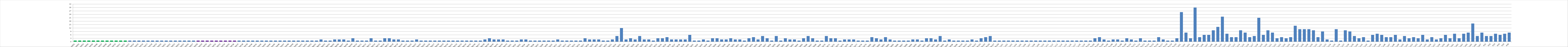
| Category | Series 0 |
|---|---|
| AW01 | 1 |
| AW02 | 1 |
| AW03 | 1 |
| AW04 | 1 |
| AW05 | 1 |
| AW06 | 1 |
| AW07 | 1 |
| AW08 | 1 |
| AW09 | 1 |
| AW10 | 1 |
| AW11 | 1 |
| AW12 | 1 |
| AW13 | 1 |
| AW14 | 1 |
| AW15 | 1 |
| AW16 | 1 |
| AW17 | 1 |
| AW18 | 1 |
| AW19 | 1 |
| AW20 | 1 |
| AW21 | 1 |
| AW22 | 1 |
| AW23 | 1 |
| AW24 | 1 |
| AW25 | 1 |
| AW26 | 1 |
| AW27 | 1 |
| AW28 | 1 |
| AW29 | 1 |
| AW30 | 1 |
| AW31 | 1 |
| AW32 | 1 |
| AW33 | 1 |
| AW34 | 1 |
| AW35 | 1 |
| AW36 | 1 |
| AW37 | 1 |
| AW38 | 1 |
| AW39 | 1 |
| AW40 | 1 |
| AW41 | 1 |
| AW42 | 1 |
| AW43 | 1 |
| AW44 | 1 |
| AW45 | 1 |
| AW46 | 1 |
| AW47 | 1 |
| AW48 | 1 |
| AW49 | 1 |
| AW50 | 1 |
| AW51 | 1 |
| AW52 | 1 |
| AW53 | 1 |
| BW01 | 1 |
| BW02 | 2 |
| BW03 | 1 |
| BW04 | 1 |
| BW05 | 2 |
| BW06 | 2 |
| BW07 | 2 |
| BW08 | 1 |
| BW09 | 3 |
| BW10 | 1 |
| BW11 | 1 |
| BW12 | 1 |
| BW13 | 3 |
| BW14 | 1 |
| BW15 | 1 |
| BW16 | 3 |
| BW17 | 3 |
| BW18 | 2 |
| BW19 | 2 |
| BW20 | 1 |
| BW21 | 1 |
| BW22 | 1 |
| BW23 | 2 |
| BW24 | 1 |
| BW25 | 1 |
| BW26 | 1 |
| BW27 | 1 |
| BW28 | 1 |
| BW29 | 1 |
| BW30 | 1 |
| BW31 | 1 |
| BW32 | 1 |
| BW33 | 1 |
| BW34 | 1 |
| BW35 | 1 |
| BW36 | 1 |
| BW37 | 1 |
| BW38 | 2 |
| BW39 | 3 |
| BW40 | 2 |
| BW41 | 2 |
| BW42 | 2 |
| BW43 | 1 |
| CW01 | 1 |
| CW02 | 1 |
| CW03 | 2 |
| CW04 | 2 |
| CW05 | 1 |
| CW06 | 1 |
| CW07 | 1 |
| CW08 | 1 |
| CW09 | 1 |
| CW10 | 1 |
| CW11 | 2 |
| CW12 | 1 |
| CW13 | 1 |
| CW14 | 1 |
| CW15 | 1 |
| CW16 | 1 |
| CW17 | 3 |
| CW18 | 2 |
| CW19 | 2 |
| CW20 | 2 |
| CW21 | 1 |
| CW22 | 1 |
| CW23 | 2 |
| CW24 | 5 |
| CW25 | 12 |
| CW26 | 2 |
| CW27 | 3 |
| CW28 | 2 |
| CW29 | 5 |
| CW30 | 2 |
| CW31 | 2 |
| CW32 | 1 |
| CW33 | 3 |
| CW34 | 3 |
| CW35 | 4 |
| CW36 | 2 |
| CW37 | 2 |
| CW38 | 2 |
| CW39 | 2 |
| CW40 | 6 |
| CW41 | 1 |
| CW42 | 1 |
| CW43 | 2 |
| CW44 | 1 |
| CW45 | 3 |
| CW46 | 3 |
| CW47 | 2 |
| CW48 | 2 |
| CW49 | 3 |
| CW50 | 2 |
| CW51 | 2 |
| CW52 | 1 |
| CW53 | 3 |
| CW54 | 4 |
| CW55 | 2 |
| CW56 | 5 |
| CW57 | 3 |
| CW58 | 1 |
| CW59 | 5 |
| CW60 | 1 |
| CW61 | 3 |
| CW62 | 2 |
| CW63 | 2 |
| CW64 | 1 |
| CW65 | 3 |
| CW66 | 5 |
| CW67 | 3 |
| CW68 | 1 |
| CW69 | 1 |
| CW70 | 5 |
| CW71 | 3 |
| CW72 | 3 |
| CW73 | 1 |
| CW74 | 2 |
| CW75 | 2 |
| CW76 | 2 |
| CW77 | 1 |
| CW78 | 1 |
| CW79 | 1 |
| CW80 | 4 |
| CW81 | 3 |
| CW82 | 2 |
| CW83 | 4 |
| CW84 | 2 |
| CW85 | 1 |
| CW86 | 1 |
| CW87 | 1 |
| CW88 | 1 |
| CW89 | 2 |
| CW90 | 2 |
| CW91 | 1 |
| CW92 | 3 |
| CW93 | 3 |
| CW94 | 2 |
| CW95 | 5 |
| CW96 | 1 |
| CW97 | 2 |
| CW98 | 1 |
| CW99 | 1 |
| CW100 | 1 |
| CW101 | 1 |
| CW102 | 2 |
| CW103 | 1 |
| CW104 | 3 |
| CW105 | 4 |
| CW106 | 5 |
| CW107 | 1 |
| CW108 | 1 |
| A.U01 | 1 |
| A.U02 | 1 |
| A.U03 | 1 |
| A.U04 | 1 |
| A.U05 | 1 |
| A.U06 | 1 |
| A.U07 | 1 |
| A.U08 | 1 |
| A.U09 | 1 |
| A.U10 | 1 |
| A.U11 | 1 |
| A.U12 | 1 |
| A.U13 | 1 |
| A.U14 | 1 |
| A.U15 | 1 |
| A.U16 | 1 |
| A.U17 | 1 |
| A.U18 | 1 |
| A.U19 | 1 |
| B.U01 | 1 |
| B.U02 | 3 |
| B.U03 | 4 |
| B.U04 | 2 |
| B.U05 | 1 |
| B.U06 | 2 |
| B.U07 | 2 |
| B.U08 | 1 |
| B.U09 | 3 |
| B.U10 | 2 |
| B.U11 | 1 |
| B.U12 | 3 |
| B.U13 | 1 |
| B.U14 | 1 |
| B.U15 | 1 |
| B.U16 | 4 |
| B.U17 | 2 |
| B.U18 | 1 |
| B.U19 | 1 |
| B.U20 | 3 |
| C.U01 | 26 |
| C.U02 | 8 |
| C.U03 | 3 |
| C.U04 | 30 |
| C.U05 | 4 |
| C.U06 | 6 |
| C.U07 | 6 |
| C.U08 | 10 |
| C.U09 | 13 |
| C.U10 | 22 |
| C.U11 | 7 |
| C.U12 | 4 |
| C.U13 | 4 |
| C.U14 | 10 |
| C.U15 | 8 |
| C.U16 | 4 |
| C.U17 | 5 |
| C.U18 | 21 |
| C.U19 | 6 |
| C.U20 | 10 |
| C.U21 | 8 |
| C.U22 | 3 |
| C.U23 | 4 |
| C.U24 | 3 |
| C.U25 | 4 |
| C.U26 | 14 |
| C.U27 | 11 |
| C.U28 | 11 |
| C.U29 | 11 |
| C.U30 | 10 |
| C.U31 | 4 |
| C.U32 | 9 |
| C.U33 | 2 |
| C.U34 | 1 |
| C.U35 | 11 |
| C.U36 | 1 |
| C.U37 | 10 |
| C.U38 | 9 |
| C.U39 | 5 |
| C.U40 | 3 |
| C.U41 | 4 |
| C.U42 | 1 |
| C.U43 | 6 |
| C.U44 | 7 |
| C.U45 | 6 |
| C.U46 | 4 |
| C.U47 | 4 |
| C.U48 | 6 |
| C.U49 | 2 |
| C.U50 | 5 |
| C.U51 | 3 |
| C.U52 | 4 |
| C.U53 | 3 |
| C.U54 | 6 |
| C.U55 | 2 |
| C.U56 | 4 |
| C.U57 | 2 |
| C.U58 | 3 |
| C.U59 | 6 |
| C.U60 | 3 |
| C.U61 | 7 |
| C.U62 | 3 |
| C.U63 | 7 |
| C.U64 | 8 |
| C.U65 | 16 |
| C.U66 | 5 |
| C.U67 | 8 |
| K01 | 5 |
| K02 | 5 |
| K03 | 7 |
| K04 | 6 |
| K05 | 7 |
| K06 | 8 |